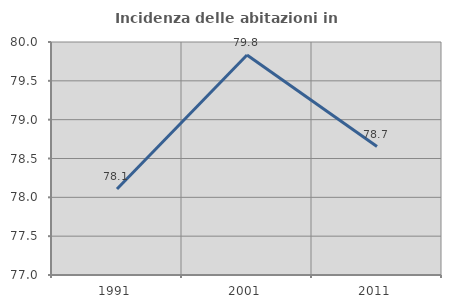
| Category | Incidenza delle abitazioni in proprietà  |
|---|---|
| 1991.0 | 78.107 |
| 2001.0 | 79.833 |
| 2011.0 | 78.654 |